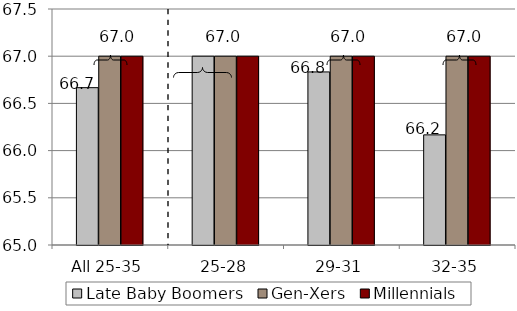
| Category | Late Baby Boomers | Gen-Xers | Millennials |
|---|---|---|---|
| All 25-35 | 66.667 | 67 | 67 |
| 25-28 | 67 | 67 | 67 |
| 29-31 | 66.833 | 67 | 67 |
| 32-35 | 66.167 | 67 | 67 |